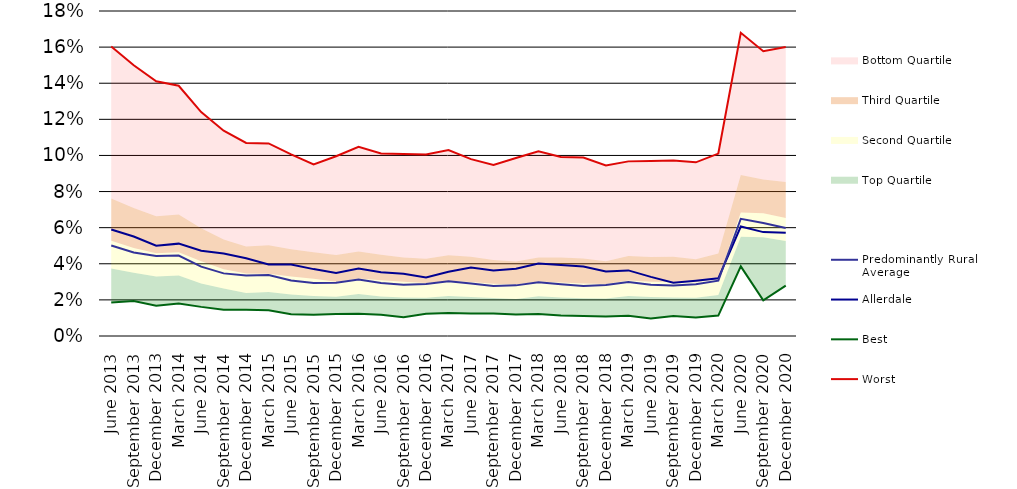
| Category | Worst | Best | Allerdale | Predominantly Rural Average |
|---|---|---|---|---|
| 0 | 0.16 | 0.019 | 0.059 | 0.05 |
| 1900-01-01 | 0.15 | 0.019 | 0.055 | 0.046 |
| 1900-01-02 | 0.141 | 0.017 | 0.05 | 0.044 |
| 1900-01-03 | 0.139 | 0.018 | 0.051 | 0.045 |
| 1900-01-04 | 0.124 | 0.016 | 0.047 | 0.038 |
| 1900-01-05 | 0.114 | 0.015 | 0.046 | 0.035 |
| 1900-01-06 | 0.107 | 0.015 | 0.043 | 0.033 |
| 1900-01-07 | 0.107 | 0.014 | 0.04 | 0.034 |
| 1900-01-08 | 0.101 | 0.012 | 0.04 | 0.031 |
| 1900-01-09 | 0.095 | 0.012 | 0.037 | 0.029 |
| 1900-01-10 | 0.1 | 0.012 | 0.035 | 0.03 |
| 1900-01-11 | 0.105 | 0.012 | 0.037 | 0.031 |
| 1900-01-12 | 0.101 | 0.012 | 0.035 | 0.029 |
| 1900-01-13 | 0.101 | 0.01 | 0.034 | 0.028 |
| 1900-01-14 | 0.101 | 0.012 | 0.032 | 0.029 |
| 1900-01-15 | 0.103 | 0.013 | 0.036 | 0.03 |
| 1900-01-16 | 0.098 | 0.013 | 0.038 | 0.029 |
| 1900-01-17 | 0.095 | 0.012 | 0.036 | 0.028 |
| 1900-01-18 | 0.099 | 0.012 | 0.037 | 0.028 |
| 1900-01-19 | 0.102 | 0.012 | 0.04 | 0.03 |
| 1900-01-20 | 0.099 | 0.011 | 0.039 | 0.029 |
| 1900-01-21 | 0.099 | 0.011 | 0.038 | 0.028 |
| 1900-01-22 | 0.094 | 0.011 | 0.036 | 0.028 |
| 1900-01-23 | 0.097 | 0.011 | 0.036 | 0.03 |
| 1900-01-24 | 0.097 | 0.01 | 0.033 | 0.028 |
| 1900-01-25 | 0.097 | 0.011 | 0.03 | 0.028 |
| 1900-01-26 | 0.096 | 0.01 | 0.031 | 0.029 |
| 1900-01-27 | 0.101 | 0.011 | 0.032 | 0.031 |
| 1900-01-28 | 0.168 | 0.039 | 0.061 | 0.065 |
| 1900-01-29 | 0.158 | 0.02 | 0.058 | 0.063 |
| 1900-01-30 | 0.16 | 0.028 | 0.057 | 0.06 |